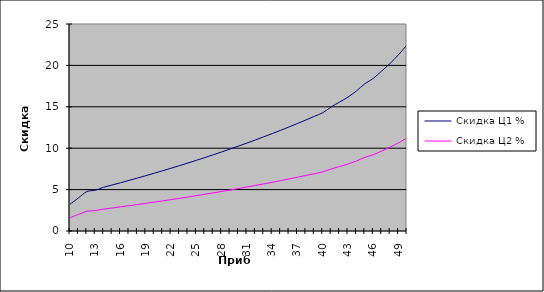
| Category | Скидка Ц1 % | Скидка Ц2 % |
|---|---|---|
| 10.0 | 3.226 | 1.613 |
| 11.0 | 3.991 | 1.996 |
| 12.0 | 4.762 | 2.381 |
| 13.0 | 4.918 | 2.459 |
| 14.0 | 5.286 | 2.643 |
| 15.0 | 5.556 | 2.778 |
| 16.0 | 5.83 | 2.915 |
| 17.0 | 6.109 | 3.054 |
| 18.0 | 6.393 | 3.196 |
| 19.0 | 6.682 | 3.341 |
| 20.0 | 6.977 | 3.488 |
| 21.0 | 7.277 | 3.638 |
| 22.0 | 7.583 | 3.791 |
| 23.0 | 7.895 | 3.947 |
| 24.0 | 8.213 | 4.106 |
| 25.0 | 8.537 | 4.268 |
| 26.0 | 8.867 | 4.433 |
| 27.0 | 9.204 | 4.602 |
| 28.0 | 9.548 | 4.774 |
| 29.0 | 9.898 | 4.949 |
| 30.0 | 10.256 | 5.128 |
| 31.0 | 10.622 | 5.311 |
| 32.0 | 10.995 | 5.497 |
| 33.0 | 11.376 | 5.688 |
| 34.0 | 11.765 | 5.882 |
| 35.0 | 12.162 | 6.081 |
| 36.0 | 12.568 | 6.284 |
| 37.0 | 12.983 | 6.492 |
| 38.0 | 13.408 | 6.704 |
| 39.0 | 13.842 | 6.921 |
| 40.0 | 14.286 | 7.143 |
| 41.0 | 14.986 | 7.493 |
| 42.0 | 15.575 | 7.787 |
| 43.0 | 16.176 | 8.088 |
| 44.0 | 16.914 | 8.457 |
| 45.0 | 17.788 | 8.894 |
| 46.0 | 18.429 | 9.215 |
| 47.0 | 19.33 | 9.665 |
| 48.0 | 20.245 | 10.123 |
| 49.0 | 21.296 | 10.648 |
| 50.0 | 22.481 | 11.24 |